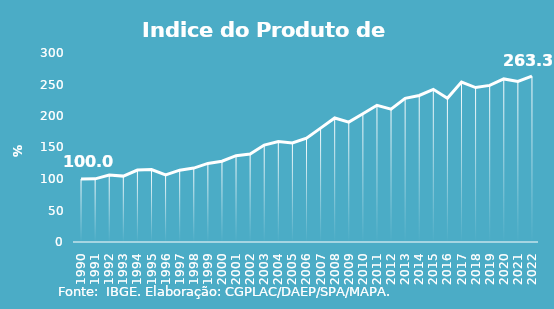
| Category | Indice de Prod. base 1990 |
|---|---|
| 1990.0 | 100 |
| 1991.0 | 100.275 |
| 1992.0 | 106.203 |
| 1993.0 | 104.57 |
| 1994.0 | 114.164 |
| 1995.0 | 115.024 |
| 1996.0 | 106.552 |
| 1997.0 | 114.037 |
| 1998.0 | 117.319 |
| 1999.0 | 124.734 |
| 2000.0 | 128.293 |
| 2001.0 | 136.975 |
| 2002.0 | 139.51 |
| 2003.0 | 153.868 |
| 2004.0 | 159.641 |
| 2005.0 | 157.136 |
| 2006.0 | 164.858 |
| 2007.0 | 180.781 |
| 2008.0 | 196.91 |
| 2009.0 | 190.309 |
| 2010.0 | 203.581 |
| 2011.0 | 217.041 |
| 2012.0 | 210.932 |
| 2013.0 | 228.009 |
| 2014.0 | 232.562 |
| 2015.0 | 242.318 |
| 2016.0 | 228.239 |
| 2017.0 | 253.826 |
| 2018.0 | 245.134 |
| 2019.0 | 248.619 |
| 2020.0 | 258.848 |
| 2021.0 | 254.988 |
| 2022.0 | 263.259 |